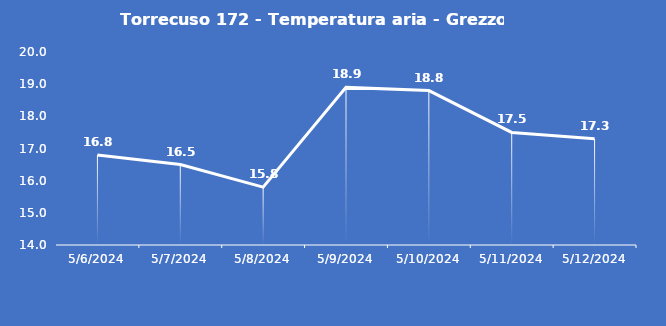
| Category | Torrecuso 172 - Temperatura aria - Grezzo (°C) |
|---|---|
| 5/6/24 | 16.8 |
| 5/7/24 | 16.5 |
| 5/8/24 | 15.8 |
| 5/9/24 | 18.9 |
| 5/10/24 | 18.8 |
| 5/11/24 | 17.5 |
| 5/12/24 | 17.3 |